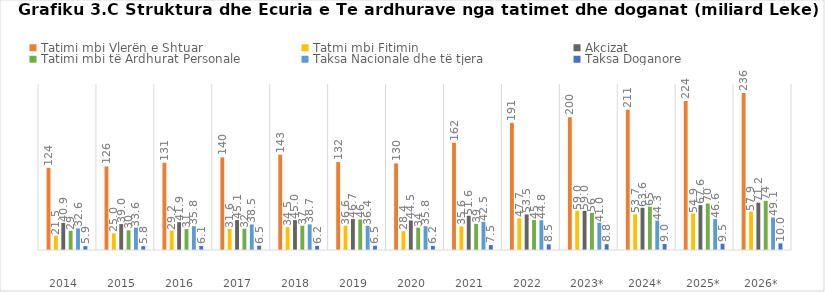
| Category | Tatimi mbi Vlerën e Shtuar | Tatmi mbi Fitimin | Akcizat | Tatimi mbi të Ardhurat Personale | Taksa Nacionale dhe të tjera | Taksa Doganore |
|---|---|---|---|---|---|---|
| 2014  | 123.73 | 21.479 | 40.894 | 28.852 | 32.606 | 5.852 |
| 2015  | 125.783 | 24.968 | 39.027 | 29.661 | 33.647 | 5.796 |
| 2016  | 131.39 | 29.151 | 41.896 | 31.412 | 35.794 | 6.137 |
| 2017  | 139.541 | 31.645 | 45.105 | 32.102 | 38.502 | 6.492 |
| 2018  | 143.464 | 34.461 | 44.987 | 36.517 | 38.673 | 6.217 |
| 2019  | 132.412 | 36.575 | 46.742 | 46.124 | 36.423 | 6.482 |
| 2020  | 130.4 | 28.38 | 44.52 | 33.65 | 35.83 | 6.2 |
| 2021  | 161.5 | 35.6 | 51.6 | 39.3 | 42.5 | 7.45 |
| 2022  | 191.4 | 47.7 | 53.5 | 45 | 44.8 | 8.5 |
| 2023* | 200 | 59 | 59 | 56 | 41 | 8.8 |
| 2024* | 211.2 | 53.68 | 63.6 | 65.2 | 44.292 | 9.02 |
| 2025* | 224.24 | 54.87 | 67.59 | 70.05 | 46.58 | 9.48 |
| 2026* | 236.32 | 57.88 | 71.23 | 73.97 | 49.05 | 9.97 |